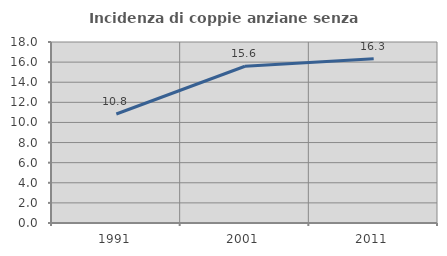
| Category | Incidenza di coppie anziane senza figli  |
|---|---|
| 1991.0 | 10.84 |
| 2001.0 | 15.588 |
| 2011.0 | 16.333 |